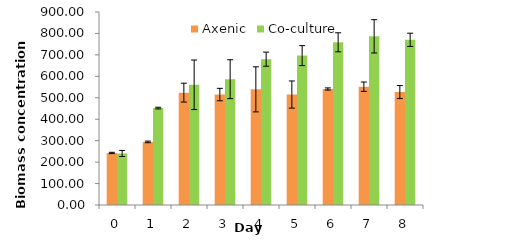
| Category | Axenic | Co-culture |
|---|---|---|
| 0.0 | 242.667 | 240.333 |
| 1.0 | 294.267 | 452 |
| 2.0 | 524 | 560.667 |
| 3.0 | 515 | 586.667 |
| 4.0 | 539.333 | 680 |
| 5.0 | 515 | 696.667 |
| 6.0 | 541 | 758.667 |
| 7.0 | 551.667 | 786.667 |
| 8.0 | 526.667 | 770.267 |